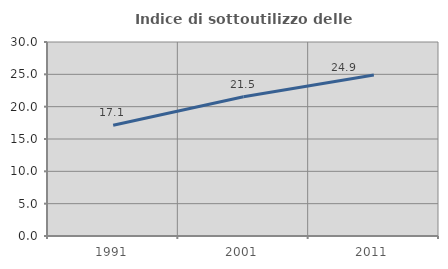
| Category | Indice di sottoutilizzo delle abitazioni  |
|---|---|
| 1991.0 | 17.12 |
| 2001.0 | 21.538 |
| 2011.0 | 24.911 |